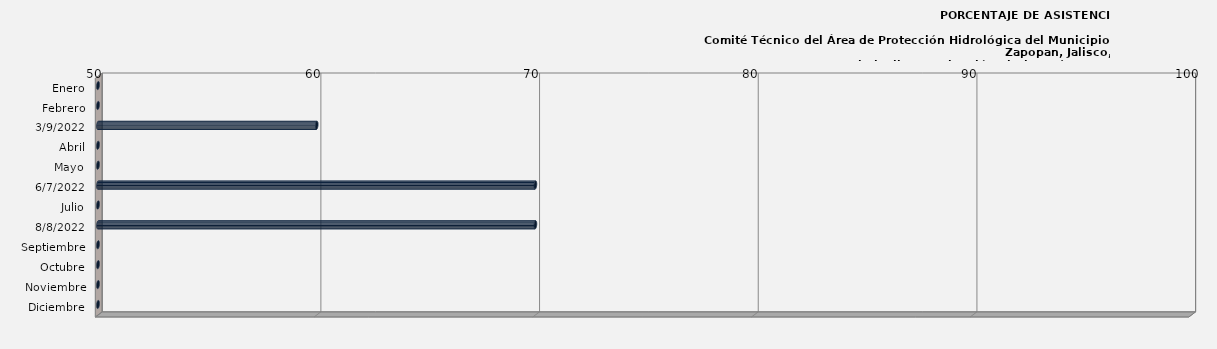
| Category | Enero |
|---|---|
| Enero | 0 |
| Febrero | 0 |
| 09/03/2022 | 60 |
| Abril | 0 |
| Mayo | 0 |
| 07/06/2022 | 70 |
| Julio | 0 |
| 08/08/2022 | 70 |
| Septiembre | 0 |
| Octubre | 0 |
| Noviembre | 0 |
| Diciembre | 0 |